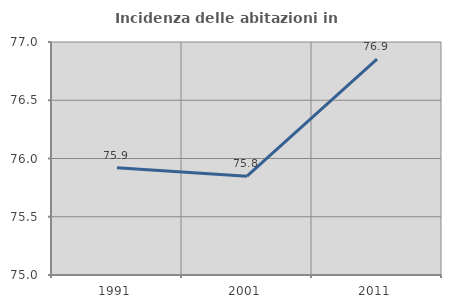
| Category | Incidenza delle abitazioni in proprietà  |
|---|---|
| 1991.0 | 75.921 |
| 2001.0 | 75.848 |
| 2011.0 | 76.854 |